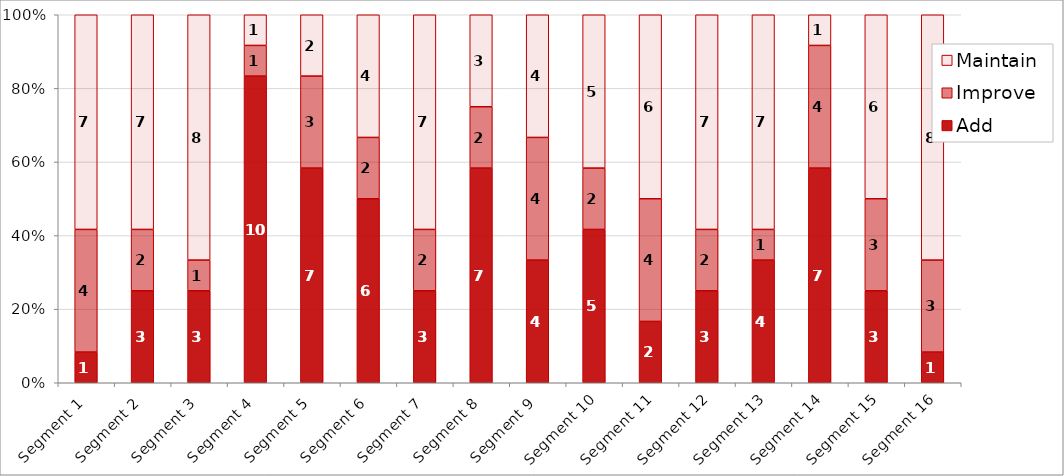
| Category | Add | Improve | Maintain |
|---|---|---|---|
| Segment 1 | 1 | 4 | 7 |
| Segment 2 | 3 | 2 | 7 |
| Segment 3 | 3 | 1 | 8 |
| Segment 4 | 10 | 1 | 1 |
| Segment 5 | 7 | 3 | 2 |
| Segment 6 | 6 | 2 | 4 |
| Segment 7 | 3 | 2 | 7 |
| Segment 8 | 7 | 2 | 3 |
| Segment 9 | 4 | 4 | 4 |
| Segment 10 | 5 | 2 | 5 |
| Segment 11 | 2 | 4 | 6 |
| Segment 12 | 3 | 2 | 7 |
| Segment 13 | 4 | 1 | 7 |
| Segment 14 | 7 | 4 | 1 |
| Segment 15 | 3 | 3 | 6 |
| Segment 16 | 1 | 3 | 8 |